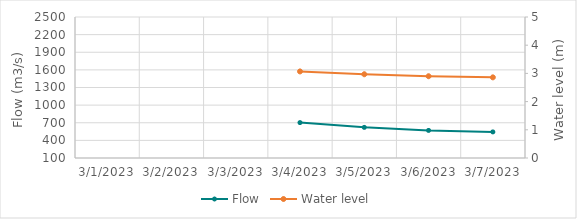
| Category | Flow |
|---|---|
| 4/26/22 | 1140.4 |
| 4/25/22 | 1211.3 |
| 4/24/22 | 1213.26 |
| 4/23/22 | 1202.39 |
| 4/22/22 | 1092.04 |
| 4/21/22 | 872.7 |
| 4/20/22 | 826.65 |